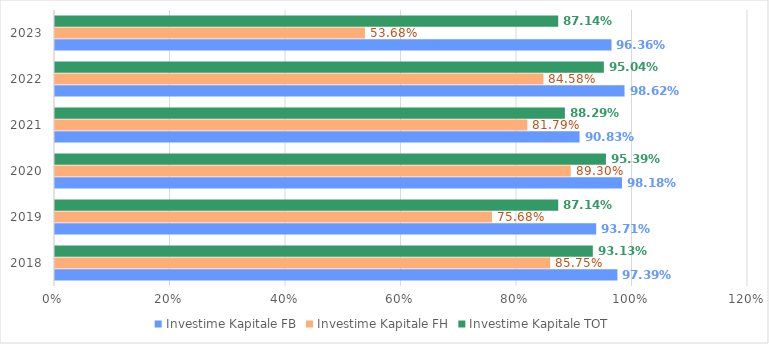
| Category | Investime Kapitale FB | Investime Kapitale FH | Investime Kapitale TOT |
|---|---|---|---|
| 2018.0 | 0.974 | 0.857 | 0.931 |
| 2019.0 | 0.937 | 0.757 | 0.871 |
| 2020.0 | 0.982 | 0.893 | 0.954 |
| 2021.0 | 0.908 | 0.818 | 0.883 |
| 2022.0 | 0.986 | 0.846 | 0.95 |
| 2023.0 | 0.964 | 0.537 | 0.871 |